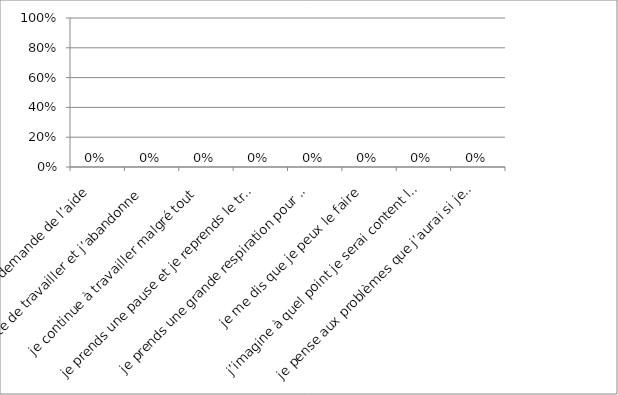
| Category | Series 0 |
|---|---|
|  je demande de l’aide  | 0 |
|  j’arrête de travailler et j’abandonne  | 0 |
|  je continue à travailler malgré tout  | 0 |
| je prends une pause et je reprends le travail  | 0 |
| je prends une grande respiration pour me calmer  | 0 |
| je me dis que je peux le faire  | 0 |
| j’imagine à quel point je serai content lorsque j’aurai fini  | 0 |
| je pense aux problèmes que j’aurai si je ne termine pas  | 0 |